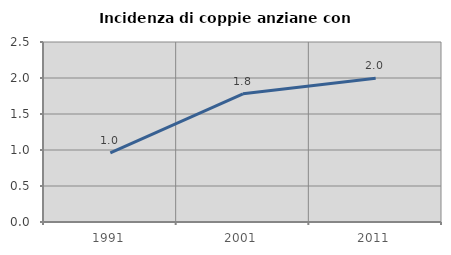
| Category | Incidenza di coppie anziane con figli |
|---|---|
| 1991.0 | 0.962 |
| 2001.0 | 1.78 |
| 2011.0 | 1.997 |